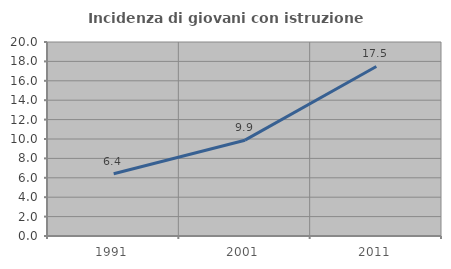
| Category | Incidenza di giovani con istruzione universitaria |
|---|---|
| 1991.0 | 6.41 |
| 2001.0 | 9.879 |
| 2011.0 | 17.476 |